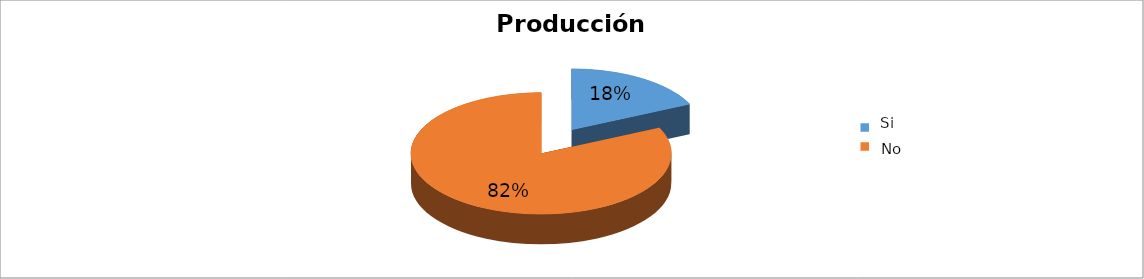
| Category | Series 0 |
|---|---|
| 0 | 0.181 |
| 1 | 0.819 |